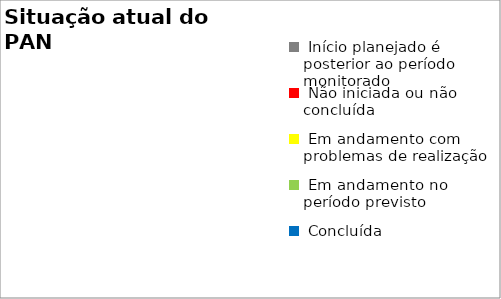
| Category | Series 0 |
|---|---|
|  Início planejado é posterior ao período monitorado | 0 |
|  Não iniciada ou não concluída | 0 |
|  Em andamento com problemas de realização | 0 |
|  Em andamento no período previsto  | 0 |
|  Concluída | 0 |